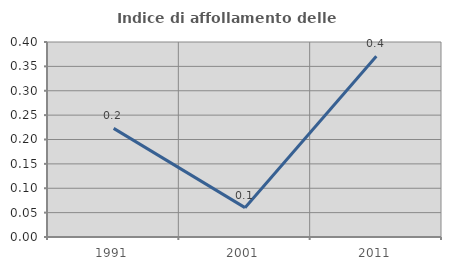
| Category | Indice di affollamento delle abitazioni  |
|---|---|
| 1991.0 | 0.223 |
| 2001.0 | 0.06 |
| 2011.0 | 0.371 |